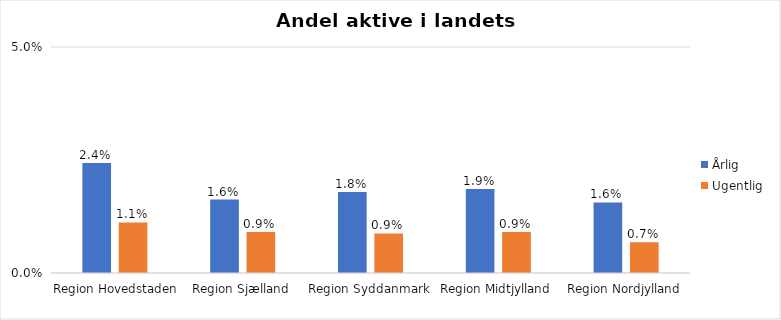
| Category | Årlig | Ugentlig |
|---|---|---|
| Region Hovedstaden | 0.024 | 0.011 |
| Region Sjælland | 0.016 | 0.009 |
| Region Syddanmark | 0.018 | 0.009 |
| Region Midtjylland | 0.019 | 0.009 |
| Region Nordjylland | 0.016 | 0.007 |